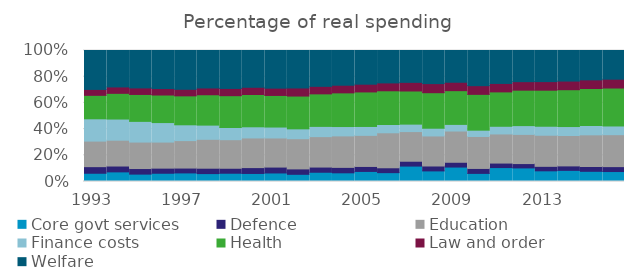
| Category |  Core govt services  |  Defence  |  Education  |  Finance costs  |  Health  |  Law and order  |  Welfare  |
|---|---|---|---|---|---|---|---|
| 1993-06-01 | 2332.509 | 1868.875 | 7231.735 | 6310.84 | 6640.642 | 1679.279 | 11009.238 |
| 1994-06-01 | 2715.463 | 1653.233 | 7292.193 | 5969.921 | 7252.792 | 1812.41 | 10283.589 |
| 1995-06-01 | 2019.333 | 1526.555 | 7237.951 | 5661.666 | 7363.029 | 1793.288 | 10230.707 |
| 1996-06-01 | 2312.156 | 1433.094 | 7311.733 | 5470.872 | 7723.932 | 1823.132 | 10667.106 |
| 1997-06-01 | 2435.564 | 1382.149 | 7794.68 | 4488.333 | 8219.845 | 1871.6 | 11006.767 |
| 1998-06-01 | 2244.843 | 1530.575 | 8211.93 | 4029.796 | 8624.395 | 1932.98 | 10639.293 |
| 1999-06-01 | 2459.292 | 1485.672 | 8508.718 | 3629.078 | 9480.895 | 2162.158 | 11301.204 |
| 2000-06-01 | 2418.141 | 1763.405 | 8923.082 | 3355.701 | 9720.645 | 2165.014 | 11069.713 |
| 2001-06-01 | 2462.901 | 1701.292 | 8405.096 | 3156.021 | 9122.872 | 2110.863 | 10867.998 |
| 2002-06-01 | 2052.954 | 1549.047 | 8629.071 | 2823.478 | 9374.267 | 2310.24 | 10711.353 |
| 2003-06-01 | 2798.098 | 1575.08 | 9216.647 | 3100.24 | 9853.773 | 2277.889 | 10857.41 |
| 2004-06-01 | 2683.326 | 1682.372 | 9733.633 | 2889.933 | 10408.636 | 2365.074 | 10732.021 |
| 2005-06-01 | 3202.976 | 1590.882 | 9894.664 | 2837.385 | 10996.428 | 2466.803 | 10729.41 |
| 2006-06-01 | 3008.4 | 1659.6 | 11896.8 | 2827.2 | 11456.4 | 2682 | 11020.8 |
| 2007-06-01 | 5665.882 | 1784.706 | 10904.706 | 2740 | 12182.353 | 3175.294 | 11715.294 |
| 2008-06-01 | 3812.63 | 1766.635 | 10802.262 | 2782.281 | 12777.003 | 3273.139 | 11908.388 |
| 2009-06-01 | 5875.671 | 1950.416 | 12716.004 | 2696.392 | 13729.51 | 3429.047 | 12919.149 |
| 2010-06-01 | 3247.316 | 1980.71 | 12801.456 | 2523.385 | 14334.486 | 3484.258 | 14080.073 |
| 2011-06-01 | 5769.749 | 1876.232 | 12082.973 | 3179.948 | 14264.131 | 3507.692 | 13664.65 |
| 2012-06-01 | 5576.712 | 1783.562 | 11973.288 | 3607.192 | 14547.945 | 3496.233 | 12784.932 |
| 2013-06-01 | 4381.633 | 1840.816 | 12759.184 | 3692.857 | 14793.878 | 3526.531 | 12761.224 |
| 2014-06-01 | 4520.837 | 1818.577 | 12351.464 | 3635.146 | 14960.335 | 3515.649 | 12419.749 |
| 2015-06-01 | 4134 | 1961 | 12879 | 3783 | 15058 | 3515 | 11932 |
| 2016-06-01 | 4084.979 | 2017.593 | 13103.402 | 3575.104 | 15561.162 | 3632.863 | 11764.979 |